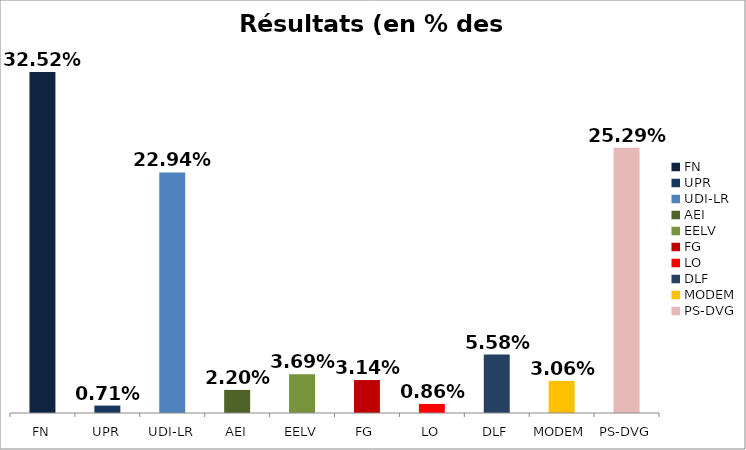
| Category | Résultats |
|---|---|
| FN | 0.325 |
| UPR | 0.007 |
| UDI-LR | 0.229 |
| AEI | 0.022 |
| EELV | 0.037 |
| FG | 0.031 |
| LO | 0.009 |
| DLF | 0.056 |
| MODEM | 0.031 |
| PS-DVG | 0.253 |